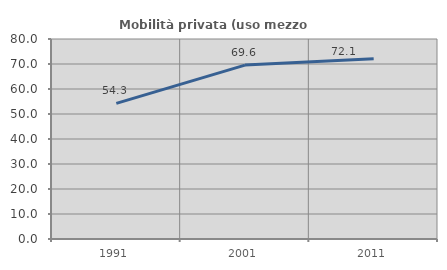
| Category | Mobilità privata (uso mezzo privato) |
|---|---|
| 1991.0 | 54.265 |
| 2001.0 | 69.556 |
| 2011.0 | 72.113 |